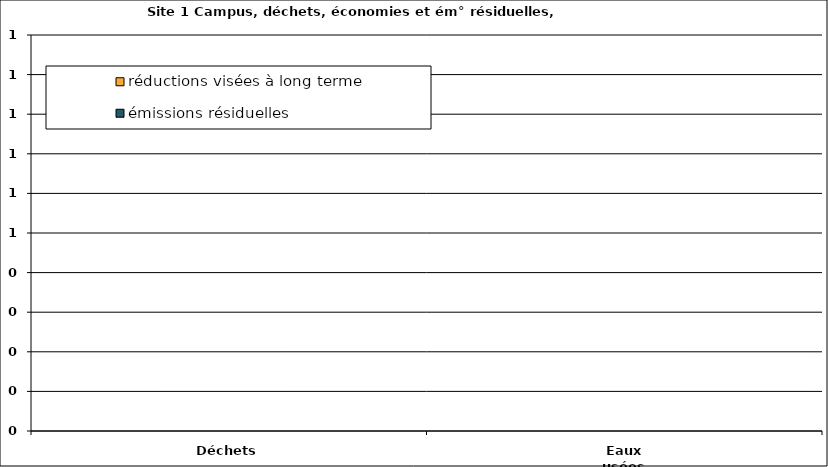
| Category | émissions résiduelles | réductions visées à long terme |
|---|---|---|
| Déchets | 0 | 0 |
| Eaux usées | 0 | 0 |